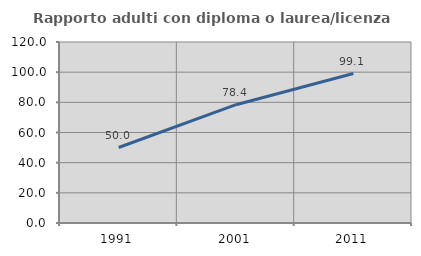
| Category | Rapporto adulti con diploma o laurea/licenza media  |
|---|---|
| 1991.0 | 50.042 |
| 2001.0 | 78.442 |
| 2011.0 | 99.083 |